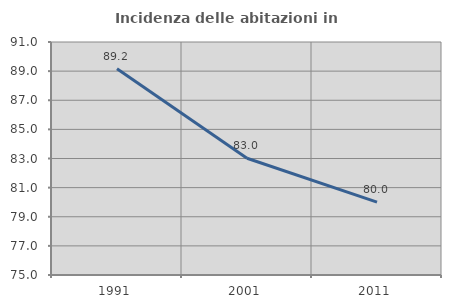
| Category | Incidenza delle abitazioni in proprietà  |
|---|---|
| 1991.0 | 89.167 |
| 2001.0 | 83.016 |
| 2011.0 | 80 |